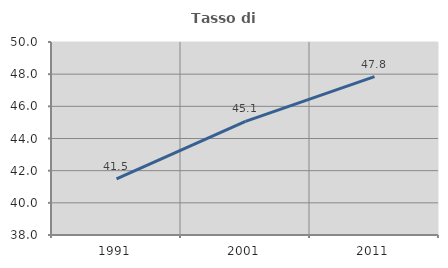
| Category | Tasso di occupazione   |
|---|---|
| 1991.0 | 41.493 |
| 2001.0 | 45.063 |
| 2011.0 | 47.848 |